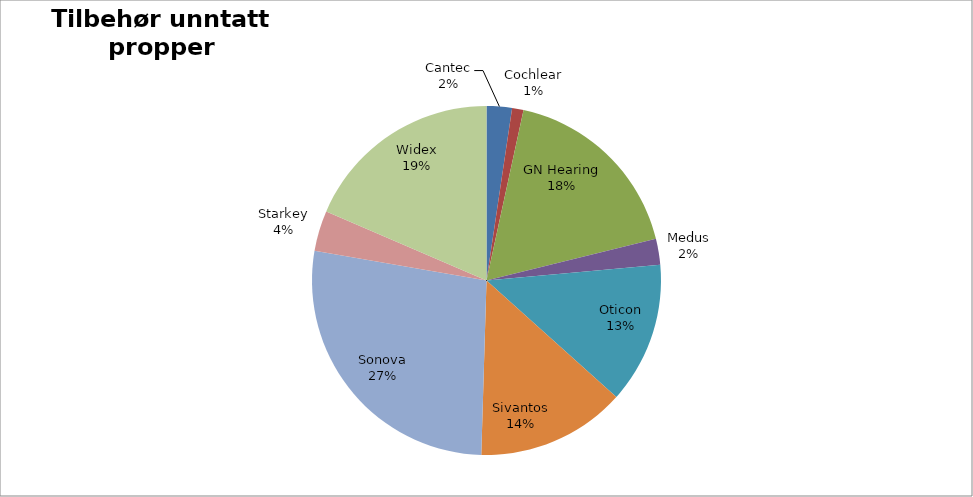
| Category | Series 0 |
|---|---|
| Cantec | 454754 |
| Cochlear | 205002 |
| GN Hearing | 3437124 |
| Medus | 467222 |
| Oticon | 2531890 |
| Sivantos | 2678303 |
| Sonova | 5275205 |
| Starkey | 728243 |
| Widex | 3586471 |